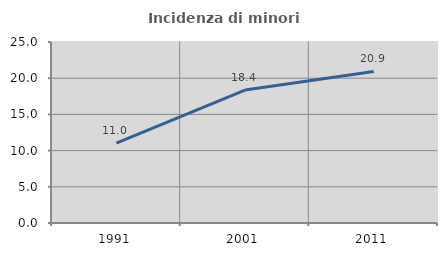
| Category | Incidenza di minori stranieri |
|---|---|
| 1991.0 | 11.034 |
| 2001.0 | 18.367 |
| 2011.0 | 20.939 |